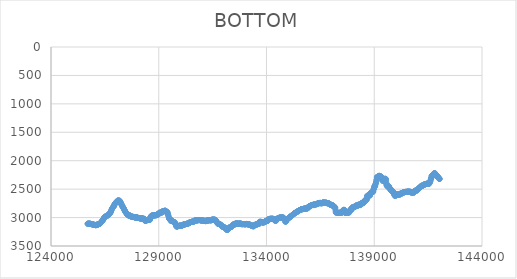
| Category | BOTTOM |
|---|---|
| 125697.8543 | 3108.33 |
| 125704.988 | 3108.33 |
| 125715.2275 | 3108.33 |
| 125725.4675 | 3108.33 |
| 125735.7075 | 3108.33 |
| 125745.9475 | 3108.33 |
| 125756.1875 | 3108.33 |
| 125766.4275 | 3108.33 |
| 125776.6675 | 3108.33 |
| 125786.9075 | 3108.33 |
| 125797.1475 | 3108.33 |
| 125807.3875 | 3108.33 |
| 125817.6275 | 3108.33 |
| 125827.8675 | 3109.05 |
| 125838.1075 | 3111.15 |
| 125848.3475 | 3111.51 |
| 125858.5875 | 3112.56 |
| 125868.8275 | 3112.91 |
| 125879.0675 | 3114.68 |
| 125889.3075 | 3116.78 |
| 125899.5475 | 3117.14 |
| 125909.7875 | 3118.54 |
| 125920.0275 | 3119.95 |
| 125930.2675 | 3120.29 |
| 125940.5075 | 3119.26 |
| 125950.7475 | 3122.41 |
| 125960.9875 | 3122.77 |
| 125971.2275 | 3123.82 |
| 125981.4675 | 3125.96 |
| 125991.7075 | 3131.19 |
| 126001.9475 | 3128.75 |
| 126012.1875 | 3129.78 |
| 126022.4275 | 3127.35 |
| 126032.6675 | 3129.45 |
| 126042.9075 | 3130.16 |
| 126053.1475 | 3132.26 |
| 126063.3875 | 3132.62 |
| 126073.6275 | 3134.74 |
| 126083.8675 | 3135.75 |
| 126094.1075 | 3128.73 |
| 126104.3475 | 3126.63 |
| 126114.5875 | 3126.99 |
| 126124.8275 | 3128.04 |
| 126135.0675 | 3127.63 |
| 126145.3075 | 3126.02 |
| 126155.5475 | 3124.41 |
| 126165.7875 | 3122.81 |
| 126176.0275 | 3121.2 |
| 126186.2675 | 3119.59 |
| 126196.5075 | 3117.98 |
| 126206.7475 | 3116.37 |
| 126216.9875 | 3114.76 |
| 126227.2275 | 3113.15 |
| 126237.4675 | 3111.54 |
| 126247.7075 | 3109.94 |
| 126257.9475 | 3108.33 |
| 126268.1875 | 3106.72 |
| 126278.4275 | 3104.31 |
| 126288.6675 | 3099.56 |
| 126298.9075 | 3094.81 |
| 126309.1475 | 3090.06 |
| 126319.3875 | 3085.31 |
| 126329.6275 | 3080.56 |
| 126339.8675 | 3075.81 |
| 126350.1075 | 3071.06 |
| 126360.3475 | 3066.22 |
| 126370.5875 | 3061.11 |
| 126380.8275 | 3056.01 |
| 126391.0675 | 3050.91 |
| 126401.3075 | 3045.81 |
| 126411.5475 | 3040.7 |
| 126421.7875 | 3035.6 |
| 126432.0275 | 3030.5 |
| 126442.2675 | 3024.19 |
| 126452.5075 | 3014.34 |
| 126462.7475 | 3004.48 |
| 126472.9875 | 2996.5 |
| 126483.2275 | 2993.99 |
| 126493.4675 | 2991.49 |
| 126503.7075 | 2988.99 |
| 126513.9475 | 2986.49 |
| 126524.1875 | 2983.98 |
| 126534.4275 | 2981.48 |
| 126544.6675 | 2978.98 |
| 126554.9075 | 2976.48 |
| 126565.1475 | 2974.09 |
| 126575.3875 | 2972.04 |
| 126585.6275 | 2969.99 |
| 126595.8675 | 2967.95 |
| 126606.1075 | 2965.9 |
| 126616.3475 | 2963.85 |
| 126626.5875 | 2961.81 |
| 126636.8275 | 2959.76 |
| 126647.0675 | 2957.71 |
| 126657.3075 | 2955.66 |
| 126667.5475 | 2953.62 |
| 126677.7875 | 2950.73 |
| 126688.0275 | 2945.38 |
| 126698.2675 | 2940.03 |
| 126708.5075 | 2934.68 |
| 126718.7475 | 2929.33 |
| 126728.9875 | 2923.99 |
| 126739.2275 | 2918.64 |
| 126749.4675 | 2913.29 |
| 126759.7075 | 2907.94 |
| 126769.9475 | 2902.59 |
| 126780.1875 | 2895.81 |
| 126790.4275 | 2884.83 |
| 126800.6675 | 2873.85 |
| 126810.9075 | 2862.87 |
| 126821.1475 | 2851.89 |
| 126831.3875 | 2842.41 |
| 126841.6275 | 2837.3 |
| 126851.8675 | 2832.2 |
| 126862.1075 | 2827.1 |
| 126872.3475 | 2822 |
| 126882.5875 | 2816.89 |
| 126892.8275 | 2811.79 |
| 126903.0675 | 2806.69 |
| 126913.3075 | 2800.59 |
| 126923.5475 | 2791.58 |
| 126933.7875 | 2782.58 |
| 126944.0275 | 2773.57 |
| 126954.2675 | 2764.56 |
| 126964.5075 | 2756.69 |
| 126974.7475 | 2752.19 |
| 126984.9875 | 2747.68 |
| 126995.2275 | 2743.18 |
| 127005.4675 | 2738.68 |
| 127015.7075 | 2734.29 |
| 127025.9475 | 2730.24 |
| 127036.1875 | 2726.19 |
| 127046.4275 | 2722.15 |
| 127056.6675 | 2718.1 |
| 127066.9075 | 2714.05 |
| 127077.1475 | 2710.01 |
| 127087.3875 | 2705.96 |
| 127097.6275 | 2701.87 |
| 127107.8675 | 2698.72 |
| 127118.1075 | 2700.5 |
| 127128.3475 | 2705.75 |
| 127138.5875 | 2705.04 |
| 127148.8275 | 2702.58 |
| 127159.0675 | 2702.25 |
| 127169.3075 | 2703.28 |
| 127179.5475 | 2701.91 |
| 127189.7875 | 2708.95 |
| 127200.0275 | 2715.99 |
| 127210.2675 | 2723.03 |
| 127220.5075 | 2730.06 |
| 127230.7475 | 2737.1 |
| 127240.9875 | 2744.5 |
| 127251.2275 | 2752.94 |
| 127261.4675 | 2761.39 |
| 127271.7075 | 2769.83 |
| 127281.9475 | 2778.28 |
| 127292.1875 | 2786.73 |
| 127302.4275 | 2794.66 |
| 127312.6675 | 2801.1 |
| 127322.9075 | 2807.53 |
| 127333.1475 | 2813.96 |
| 127343.3875 | 2820.4 |
| 127353.6275 | 2826.83 |
| 127363.8675 | 2833.27 |
| 127374.1075 | 2840.06 |
| 127384.3475 | 2847.9 |
| 127394.5875 | 2855.75 |
| 127404.8275 | 2863.59 |
| 127415.0675 | 2871.43 |
| 127425.3075 | 2879.27 |
| 127435.5475 | 2887.12 |
| 127445.7875 | 2894.35 |
| 127456.0275 | 2899.81 |
| 127466.2675 | 2905.26 |
| 127476.5075 | 2910.72 |
| 127486.7475 | 2916.17 |
| 127496.9875 | 2921.62 |
| 127507.2275 | 2927.08 |
| 127517.4675 | 2932.53 |
| 127527.7075 | 2939.11 |
| 127537.9475 | 2946.81 |
| 127548.1875 | 2947.86 |
| 127558.4275 | 2948.22 |
| 127568.6675 | 2948.56 |
| 127578.9075 | 2948.24 |
| 127589.1475 | 2955.28 |
| 127599.3875 | 2962.32 |
| 127609.6275 | 2966.14 |
| 127619.8675 | 2961.94 |
| 127630.1075 | 2962.3 |
| 127640.3475 | 2963.35 |
| 127650.5875 | 2963.71 |
| 127660.8275 | 2965.47 |
| 127671.0675 | 2967.93 |
| 127681.3075 | 2968.98 |
| 127691.5475 | 2969.34 |
| 127701.7875 | 2970.74 |
| 127712.0275 | 2975.37 |
| 127722.2675 | 2985.87 |
| 127732.5075 | 2985.87 |
| 127742.7475 | 2984.8 |
| 127752.9875 | 2982.36 |
| 127763.2275 | 2984.46 |
| 127773.4675 | 2985.53 |
| 127783.7075 | 2988.69 |
| 127793.9475 | 2989.76 |
| 127804.1875 | 2992.91 |
| 127814.4275 | 2991.84 |
| 127824.6675 | 2987.97 |
| 127834.9075 | 2986.94 |
| 127845.1475 | 2990.45 |
| 127855.3875 | 2991.5 |
| 127865.6275 | 2991.86 |
| 127875.8675 | 2992.91 |
| 127886.1075 | 2993.62 |
| 127896.3475 | 2996.8 |
| 127906.5875 | 2999.59 |
| 127916.8275 | 2998.54 |
| 127927.0675 | 2998.54 |
| 127937.3075 | 2998.9 |
| 127947.5475 | 2999.95 |
| 127957.7875 | 3000.3 |
| 127968.0275 | 3000.28 |
| 127978.2675 | 2996.06 |
| 127988.5075 | 2993.98 |
| 127998.7475 | 2998.2 |
| 128008.9875 | 3002.07 |
| 128019.2275 | 3004.53 |
| 128029.4675 | 3005.93 |
| 128039.7075 | 3006.98 |
| 128049.9475 | 3006.98 |
| 128060.1875 | 3007.34 |
| 128070.4275 | 3008.39 |
| 128080.6675 | 3008.39 |
| 128090.9075 | 3008.39 |
| 128101.1475 | 3008.39 |
| 128111.3875 | 3009.46 |
| 128121.6275 | 3013.33 |
| 128131.8675 | 3015.43 |
| 128142.1075 | 3015.43 |
| 128152.3475 | 3015.07 |
| 128162.5875 | 3014.38 |
| 128172.8275 | 3014.72 |
| 128183.0675 | 3012.62 |
| 128193.3075 | 3012.62 |
| 128203.5475 | 3012.97 |
| 128213.7875 | 3014.38 |
| 128224.0275 | 3015.43 |
| 128234.2675 | 3016.15 |
| 128244.5075 | 3018.96 |
| 128254.7475 | 3021.42 |
| 128264.9875 | 3021.75 |
| 128275.2275 | 3019.3 |
| 128285.4675 | 3018.6 |
| 128295.7075 | 3020.37 |
| 128305.9475 | 3022.47 |
| 128316.1875 | 3022.83 |
| 128326.4275 | 3023.88 |
| 128336.6675 | 3024.95 |
| 128346.9075 | 3035.25 |
| 128357.1475 | 3055.18 |
| 128367.3875 | 3052.39 |
| 128377.6275 | 3053.44 |
| 128387.8675 | 3053.08 |
| 128398.1075 | 3052.39 |
| 128408.3475 | 3053.44 |
| 128418.5875 | 3052.36 |
| 128428.8275 | 3048.14 |
| 128439.0675 | 3044.63 |
| 128449.3075 | 3042.87 |
| 128459.5475 | 3041.84 |
| 128469.7875 | 3045.35 |
| 128480.0275 | 3046.04 |
| 128490.2675 | 3044.63 |
| 128500.5075 | 3043.23 |
| 128510.7475 | 3041.82 |
| 128520.9875 | 3039.7 |
| 128531.2275 | 3036.9 |
| 128541.4675 | 3037.95 |
| 128551.7075 | 3037.95 |
| 128561.9475 | 3038.31 |
| 128572.1875 | 3040.43 |
| 128582.4275 | 3043.58 |
| 128592.6675 | 3032.15 |
| 128602.9075 | 2998.9 |
| 128613.1475 | 2999.95 |
| 128623.3875 | 3001.02 |
| 128633.6275 | 3004.17 |
| 128643.8675 | 2995.95 |
| 128654.1075 | 2971.08 |
| 128664.3475 | 2967.91 |
| 128674.5875 | 2965.83 |
| 128684.8275 | 2969.69 |
| 128695.0675 | 2972.51 |
| 128705.3075 | 2973.89 |
| 128715.5475 | 2967.86 |
| 128725.7875 | 2956.31 |
| 128736.0275 | 2956.31 |
| 128746.2675 | 2956.67 |
| 128756.5075 | 2958.79 |
| 128766.7475 | 2962.66 |
| 128776.9875 | 2964.76 |
| 128787.2275 | 2964.4 |
| 128797.4675 | 2962.28 |
| 128807.7075 | 2958.05 |
| 128817.9475 | 2955.97 |
| 128828.1875 | 2959.84 |
| 128838.4275 | 2961.23 |
| 128848.6675 | 2959.48 |
| 128858.9075 | 2959.46 |
| 128869.1475 | 2956.31 |
| 128879.3875 | 2956.67 |
| 128889.6275 | 2958.08 |
| 128899.8675 | 2958.05 |
| 128910.1075 | 2954.19 |
| 128920.3475 | 2952.09 |
| 128930.5875 | 2952.44 |
| 128940.8275 | 2949.21 |
| 128951.0675 | 2936.6 |
| 128961.3075 | 2936.25 |
| 128971.5475 | 2936.27 |
| 128981.7875 | 2938.35 |
| 128992.0275 | 2935.2 |
| 129002.2675 | 2936.27 |
| 129012.5075 | 2933.34 |
| 129022.7475 | 2915.49 |
| 129032.9875 | 2915.13 |
| 129043.2275 | 2914.8 |
| 129053.4675 | 2917.97 |
| 129063.7075 | 2921.12 |
| 129073.9475 | 2921.48 |
| 129084.1875 | 2919.31 |
| 129094.4275 | 2909.86 |
| 129104.6675 | 2908.79 |
| 129114.9075 | 2904.56 |
| 129125.1475 | 2902.49 |
| 129135.3875 | 2906.35 |
| 129145.6275 | 2908.81 |
| 129155.8675 | 2910.22 |
| 129166.1075 | 2906.26 |
| 129176.3475 | 2891.56 |
| 129186.5875 | 2890.85 |
| 129196.8275 | 2887.67 |
| 129207.0675 | 2883.81 |
| 129217.3075 | 2882.78 |
| 129227.5475 | 2887 |
| 129237.7875 | 2889.8 |
| 129248.0275 | 2888.74 |
| 129258.2675 | 2888.39 |
| 129268.5075 | 2886.27 |
| 129278.7475 | 2882.04 |
| 129288.9875 | 2878.18 |
| 129299.2275 | 2877.15 |
| 129309.4675 | 2881.01 |
| 129319.7075 | 2883.47 |
| 129329.9475 | 2885.59 |
| 129340.1875 | 2890.53 |
| 129350.4275 | 2896.5 |
| 129360.6675 | 2898.6 |
| 129370.9075 | 2898.96 |
| 129381.1475 | 2900.36 |
| 129391.3875 | 2902.49 |
| 129401.6275 | 2906.71 |
| 129411.8675 | 2916.65 |
| 129422.1075 | 2937.32 |
| 129432.3475 | 2943.47 |
| 129442.5875 | 2959.42 |
| 129452.8275 | 2975.37 |
| 129463.0675 | 2991.21 |
| 129473.3075 | 3006.69 |
| 129483.5475 | 3019.32 |
| 129493.7875 | 3023.18 |
| 129504.0275 | 3026.36 |
| 129514.2675 | 3030.22 |
| 129524.5075 | 3033.04 |
| 129534.7475 | 3035.49 |
| 129544.9875 | 3041.19 |
| 129555.2275 | 3055.56 |
| 129565.4675 | 3057.66 |
| 129575.7075 | 3057.3 |
| 129585.9475 | 3055.18 |
| 129596.1875 | 3050.96 |
| 129606.4275 | 3048.88 |
| 129616.6675 | 3053.1 |
| 129626.9075 | 3057.32 |
| 129637.1475 | 3061.55 |
| 129647.3875 | 3065.05 |
| 129657.6275 | 3068.25 |
| 129667.8675 | 3074.55 |
| 129678.1075 | 3075.26 |
| 129688.3475 | 3077.01 |
| 129698.5875 | 3077.03 |
| 129708.8275 | 3079.82 |
| 129719.0675 | 3079.85 |
| 129729.3075 | 3084.07 |
| 129739.5475 | 3087.93 |
| 129749.7875 | 3091.82 |
| 129760.0275 | 3099.13 |
| 129770.2675 | 3107.22 |
| 129780.5075 | 3115.31 |
| 129790.7475 | 3123.41 |
| 129800.9875 | 3133.02 |
| 129811.2275 | 3147.1 |
| 129821.4675 | 3157.51 |
| 129831.7075 | 3157.16 |
| 129841.9475 | 3156.81 |
| 129852.1875 | 3156.45 |
| 129862.4275 | 3155.72 |
| 129872.6675 | 3153.84 |
| 129882.9075 | 3151.96 |
| 129893.1475 | 3149.49 |
| 129903.3875 | 3146.7 |
| 129913.6275 | 3147.39 |
| 129923.8675 | 3146.34 |
| 129934.1075 | 3145.98 |
| 129944.3475 | 3144.93 |
| 129954.5875 | 3144.93 |
| 129964.8275 | 3144.22 |
| 129975.0675 | 3142.12 |
| 129985.3075 | 3142.12 |
| 129995.5475 | 3142.12 |
| 130005.7875 | 3142.12 |
| 130016.0275 | 3142.12 |
| 130026.2675 | 3142.12 |
| 130036.5075 | 3142.12 |
| 130046.7475 | 3141.76 |
| 130056.9875 | 3141.42 |
| 130067.2275 | 3143.17 |
| 130077.4675 | 3141.04 |
| 130087.7075 | 3137.18 |
| 130097.9475 | 3135.08 |
| 130108.1875 | 3134.72 |
| 130118.4275 | 3133.31 |
| 130128.6675 | 3130.83 |
| 130138.9075 | 3126.27 |
| 130149.1475 | 3124.15 |
| 130159.3875 | 3121 |
| 130169.6275 | 3121 |
| 130179.8675 | 3121 |
| 130190.1075 | 3121 |
| 130200.3475 | 3121 |
| 130210.5875 | 3120.29 |
| 130220.8275 | 3117.11 |
| 130231.0675 | 3113.96 |
| 130241.3075 | 3113.96 |
| 130251.5475 | 3113.61 |
| 130261.7875 | 3112.56 |
| 130272.0275 | 3112.91 |
| 130282.2675 | 3113.96 |
| 130292.5075 | 3113.61 |
| 130302.7475 | 3111.48 |
| 130312.9875 | 3107.98 |
| 130323.2275 | 3106.57 |
| 130333.4675 | 3105.52 |
| 130343.7075 | 3105.16 |
| 130353.9475 | 3103.04 |
| 130364.1875 | 3099.89 |
| 130374.4275 | 3099.89 |
| 130384.6675 | 3099.89 |
| 130394.9075 | 3099.89 |
| 130405.1475 | 3099.53 |
| 130415.3875 | 3095.98 |
| 130425.6275 | 3087.91 |
| 130435.8675 | 3085.81 |
| 130446.1075 | 3085.1 |
| 130456.3475 | 3082.64 |
| 130466.5875 | 3080.87 |
| 130476.8275 | 3079.13 |
| 130487.0675 | 3079.47 |
| 130497.3075 | 3077.72 |
| 130507.5475 | 3078.06 |
| 130517.7875 | 3075.6 |
| 130528.0275 | 3074.19 |
| 130538.2675 | 3073.14 |
| 130548.5075 | 3073.14 |
| 130558.7475 | 3073.14 |
| 130568.9875 | 3073.5 |
| 130579.2275 | 3073.48 |
| 130589.4675 | 3071.04 |
| 130599.7075 | 3073.14 |
| 130609.9475 | 3072.43 |
| 130620.1875 | 3069.97 |
| 130630.4275 | 3068.92 |
| 130640.6675 | 3066.06 |
| 130650.9075 | 3056.59 |
| 130661.1475 | 3053.44 |
| 130671.3875 | 3053.08 |
| 130681.6275 | 3052.39 |
| 130691.8675 | 3052.72 |
| 130702.1075 | 3050.26 |
| 130712.3475 | 3049.57 |
| 130722.5875 | 3050.26 |
| 130732.8275 | 3048.5 |
| 130743.0675 | 3047.11 |
| 130753.3075 | 3049.21 |
| 130763.5475 | 3049.21 |
| 130773.7875 | 3049.21 |
| 130784.0275 | 3049.21 |
| 130794.2675 | 3048.14 |
| 130804.5075 | 3044.99 |
| 130814.7475 | 3044.99 |
| 130824.9875 | 3045.35 |
| 130835.2275 | 3046.4 |
| 130845.4675 | 3045.68 |
| 130855.7075 | 3042.87 |
| 130865.9475 | 3041.12 |
| 130876.1875 | 3043.25 |
| 130886.4275 | 3045.68 |
| 130896.6675 | 3043.94 |
| 130906.9075 | 3044.99 |
| 130917.1475 | 3044.99 |
| 130927.3875 | 3045.35 |
| 130937.6275 | 3046.4 |
| 130947.8675 | 3046.4 |
| 130958.1075 | 3046.76 |
| 130968.3475 | 3048.16 |
| 130978.5875 | 3049.93 |
| 130988.8275 | 3052.74 |
| 130999.0675 | 3055.2 |
| 131009.3075 | 3055.89 |
| 131019.5475 | 3054.13 |
| 131029.7875 | 3052.03 |
| 131040.0275 | 3051.67 |
| 131050.2675 | 3050.98 |
| 131060.5075 | 3052.39 |
| 131070.7475 | 3053.44 |
| 131080.9875 | 3053.79 |
| 131091.2275 | 3055.56 |
| 131101.4675 | 3058.02 |
| 131111.7075 | 3059.07 |
| 131121.9475 | 3059.07 |
| 131132.1875 | 3059.07 |
| 131142.4275 | 3059.78 |
| 131152.6675 | 3061.17 |
| 131162.9075 | 3060.14 |
| 131173.1475 | 3063.29 |
| 131183.3875 | 3063.65 |
| 131193.6275 | 3061.84 |
| 131203.8675 | 3053.44 |
| 131214.1075 | 3053.08 |
| 131224.3475 | 3052.03 |
| 131234.5875 | 3052.03 |
| 131244.8275 | 3052.03 |
| 131255.0675 | 3052.74 |
| 131265.3075 | 3054.84 |
| 131275.5475 | 3054.84 |
| 131285.7875 | 3054.49 |
| 131296.0275 | 3050.93 |
| 131306.2675 | 3043.94 |
| 131316.5075 | 3044.99 |
| 131326.7475 | 3044.28 |
| 131336.9875 | 3042.18 |
| 131347.2275 | 3043.25 |
| 131357.4675 | 3046.04 |
| 131367.7075 | 3044.63 |
| 131377.9475 | 3044.3 |
| 131388.1875 | 3047.47 |
| 131398.4275 | 3050.62 |
| 131408.6675 | 3049.55 |
| 131418.9075 | 3047.47 |
| 131429.1475 | 3048.12 |
| 131439.3875 | 3040.05 |
| 131449.6275 | 3039.02 |
| 131459.8675 | 3041.46 |
| 131470.1075 | 3039.36 |
| 131480.3475 | 3038.65 |
| 131490.5875 | 3037.62 |
| 131500.8275 | 3040.41 |
| 131511.0675 | 3038.29 |
| 131521.3075 | 3034.78 |
| 131531.5475 | 3033.73 |
| 131541.7875 | 3035.52 |
| 131552.0275 | 3040.77 |
| 131562.2675 | 3040.77 |
| 131572.5075 | 3039.7 |
| 131582.7475 | 3036.19 |
| 131592.9875 | 3035.85 |
| 131603.2275 | 3038.67 |
| 131613.4675 | 3041.48 |
| 131623.7075 | 3044.3 |
| 131633.9475 | 3047.11 |
| 131644.1875 | 3049.93 |
| 131654.4275 | 3053.64 |
| 131664.6675 | 3059.97 |
| 131674.9075 | 3066.3 |
| 131685.1475 | 3072.64 |
| 131695.3875 | 3079.15 |
| 131705.6275 | 3086.19 |
| 131715.8675 | 3093.23 |
| 131726.1075 | 3099.55 |
| 131736.3475 | 3103.77 |
| 131746.5875 | 3107.28 |
| 131756.8275 | 3109.05 |
| 131767.0675 | 3111.86 |
| 131777.3075 | 3113.25 |
| 131787.5475 | 3111.51 |
| 131797.7875 | 3112.91 |
| 131808.0275 | 3114.32 |
| 131818.2675 | 3116.44 |
| 131828.5075 | 3119.24 |
| 131838.7475 | 3118.54 |
| 131848.9875 | 3119.59 |
| 131859.2275 | 3121.74 |
| 131869.4675 | 3129.11 |
| 131879.7075 | 3132.98 |
| 131889.9475 | 3135.44 |
| 131900.1875 | 3136.49 |
| 131910.4275 | 3137.56 |
| 131920.6675 | 3144.28 |
| 131930.9075 | 3155.14 |
| 131941.1475 | 3156.19 |
| 131951.3875 | 3156.55 |
| 131961.6275 | 3157.6 |
| 131971.8675 | 3158.67 |
| 131982.1075 | 3161.82 |
| 131992.3475 | 3162.89 |
| 132002.5875 | 3165.69 |
| 132012.8275 | 3164.64 |
| 132023.0675 | 3166.07 |
| 132033.3075 | 3171.34 |
| 132043.5475 | 3175.56 |
| 132053.7875 | 3178.36 |
| 132064.0275 | 3177.66 |
| 132074.2675 | 3179.43 |
| 132084.5075 | 3182.6 |
| 132094.7475 | 3186.82 |
| 132104.9875 | 3191.17 |
| 132115.2275 | 3195.86 |
| 132125.4675 | 3200.55 |
| 132135.7075 | 3204.77 |
| 132145.9475 | 3208.65 |
| 132156.1875 | 3214.98 |
| 132166.4275 | 3218.48 |
| 132176.6675 | 3218.46 |
| 132186.9075 | 3214.24 |
| 132197.1475 | 3210.37 |
| 132207.3875 | 3207.56 |
| 132217.6275 | 3204.74 |
| 132227.8675 | 3200.86 |
| 132238.1075 | 3193.82 |
| 132248.3475 | 3187.64 |
| 132258.5875 | 3183.98 |
| 132268.8275 | 3180.32 |
| 132279.0675 | 3176.66 |
| 132289.3075 | 3173 |
| 132299.5475 | 3169.91 |
| 132309.7875 | 3168.5 |
| 132320.0275 | 3167.1 |
| 132330.2675 | 3165.69 |
| 132340.5075 | 3164.28 |
| 132350.7475 | 3162.87 |
| 132360.9875 | 3162.18 |
| 132371.2275 | 3162.16 |
| 132381.4675 | 3159.01 |
| 132391.7075 | 3155.43 |
| 132401.9475 | 3143.86 |
| 132412.1875 | 3139.64 |
| 132422.4275 | 3135.77 |
| 132432.6675 | 3133.31 |
| 132442.9075 | 3132.26 |
| 132453.1475 | 3132.26 |
| 132463.3875 | 3128.33 |
| 132473.6275 | 3116.78 |
| 132483.8675 | 3117.14 |
| 132494.1075 | 3117.83 |
| 132504.3475 | 3117.14 |
| 132514.5875 | 3119.26 |
| 132524.8275 | 3123.48 |
| 132535.0675 | 3122.34 |
| 132545.3075 | 3110.1 |
| 132555.5475 | 3110.08 |
| 132565.7875 | 3105.85 |
| 132576.0275 | 3103.06 |
| 132586.2675 | 3104.11 |
| 132596.5075 | 3104.11 |
| 132606.7475 | 3104.82 |
| 132616.9875 | 3105.85 |
| 132627.2275 | 3103.42 |
| 132637.4675 | 3105.52 |
| 132647.7075 | 3106.23 |
| 132657.9475 | 3108.69 |
| 132668.1875 | 3109.74 |
| 132678.4275 | 3110.81 |
| 132688.6675 | 3112.89 |
| 132698.9075 | 3108.67 |
| 132709.1475 | 3105.52 |
| 132719.3875 | 3105.88 |
| 132729.6275 | 3107.28 |
| 132739.8675 | 3107.62 |
| 132750.1075 | 3105.88 |
| 132760.3475 | 3106.57 |
| 132770.5875 | 3105.52 |
| 132780.8275 | 3105.88 |
| 132791.0675 | 3106.57 |
| 132801.3075 | 3105.88 |
| 132811.5475 | 3107.28 |
| 132821.7875 | 3109.4 |
| 132832.0275 | 3112.91 |
| 132842.2675 | 3114.32 |
| 132852.5075 | 3115.73 |
| 132862.7475 | 3116.78 |
| 132872.9875 | 3116.78 |
| 132883.2275 | 3116.42 |
| 132893.4675 | 3115.37 |
| 132903.7075 | 3115.01 |
| 132913.9475 | 3114.32 |
| 132924.1875 | 3115.37 |
| 132934.4275 | 3115.01 |
| 132944.6675 | 3113.96 |
| 132954.9075 | 3114.32 |
| 132965.1475 | 3115.73 |
| 132975.3875 | 3116.78 |
| 132985.6275 | 3116.78 |
| 132995.8675 | 3117.14 |
| 133006.1075 | 3118.54 |
| 133016.3475 | 3119.24 |
| 133026.5875 | 3117.83 |
| 133036.8275 | 3116.06 |
| 133047.0675 | 3113.96 |
| 133057.3075 | 3114.32 |
| 133067.5475 | 3114.3 |
| 133077.7875 | 3111.51 |
| 133088.0275 | 3112.56 |
| 133098.2675 | 3113.27 |
| 133108.5075 | 3116.44 |
| 133118.7475 | 3118.52 |
| 133128.9875 | 3115.73 |
| 133139.2275 | 3117.14 |
| 133149.4675 | 3118.54 |
| 133159.7075 | 3119.59 |
| 133169.9475 | 3119.95 |
| 133180.1875 | 3121 |
| 133190.4275 | 3122.07 |
| 133200.6675 | 3124.51 |
| 133210.9075 | 3122.41 |
| 133221.1475 | 3123.12 |
| 133231.3875 | 3126.3 |
| 133241.6275 | 3129.45 |
| 133251.8675 | 3129.8 |
| 133262.1075 | 3131.93 |
| 133272.3475 | 3136.15 |
| 133282.5875 | 3139.66 |
| 133292.8275 | 3140.35 |
| 133303.0675 | 3139.3 |
| 133313.3075 | 3140.37 |
| 133323.5475 | 3143.52 |
| 133333.7875 | 3143.52 |
| 133344.0275 | 3144.6 |
| 133354.2675 | 3148.46 |
| 133364.5075 | 3151.28 |
| 133374.7475 | 3153.38 |
| 133384.9875 | 3153.38 |
| 133395.2275 | 3153.02 |
| 133405.4675 | 3152.68 |
| 133415.7075 | 3149.07 |
| 133425.9475 | 3131.91 |
| 133436.1875 | 3130.5 |
| 133446.4275 | 3129.45 |
| 133456.6675 | 3129.45 |
| 133466.9075 | 3129.09 |
| 133477.1475 | 3128.04 |
| 133487.3875 | 3126.97 |
| 133497.6275 | 3123.46 |
| 133507.8675 | 3122.41 |
| 133518.1075 | 3121.69 |
| 133528.3475 | 3119.95 |
| 133538.5875 | 3121 |
| 133548.8275 | 3120.29 |
| 133559.0675 | 3118.54 |
| 133569.3075 | 3118.52 |
| 133579.5475 | 3115.37 |
| 133589.7875 | 3115.37 |
| 133600.0275 | 3114.3 |
| 133610.2675 | 3111.15 |
| 133620.5075 | 3111.15 |
| 133630.7475 | 3111.15 |
| 133640.9875 | 3111.51 |
| 133651.2275 | 3112.56 |
| 133661.4675 | 3103.62 |
| 133671.7075 | 3077.01 |
| 133681.9475 | 3075.96 |
| 133692.1875 | 3075.6 |
| 133702.4275 | 3074.55 |
| 133712.6675 | 3074.19 |
| 133722.9075 | 3073.86 |
| 133733.1475 | 3075.96 |
| 133743.3875 | 3076.32 |
| 133753.6275 | 3077.01 |
| 133763.8675 | 3075.96 |
| 133774.1075 | 3076.67 |
| 133784.3475 | 3078.77 |
| 133794.5875 | 3079.85 |
| 133804.8275 | 3083 |
| 133815.0675 | 3084.07 |
| 133825.3075 | 3086.86 |
| 133835.5475 | 3086.17 |
| 133845.7875 | 3086.86 |
| 133856.0275 | 3085.81 |
| 133866.2675 | 3084.74 |
| 133876.5075 | 3080.52 |
| 133886.7475 | 3078.44 |
| 133896.9875 | 3081.23 |
| 133907.2275 | 3080.18 |
| 133917.4675 | 3079.82 |
| 133927.7075 | 3078.42 |
| 133937.9475 | 3074.86 |
| 133948.1875 | 3066.8 |
| 133958.4275 | 3063.62 |
| 133968.6675 | 3059.4 |
| 133978.9075 | 3056.61 |
| 133989.1475 | 3057.66 |
| 133999.3875 | 3058.02 |
| 134009.6275 | 3059.07 |
| 134019.8675 | 3059.07 |
| 134030.1075 | 3059.42 |
| 134040.3475 | 3060.47 |
| 134050.5875 | 3060.47 |
| 134060.8275 | 3053.68 |
| 134071.0675 | 3033.37 |
| 134081.3075 | 3033.04 |
| 134091.5475 | 3034.42 |
| 134101.7875 | 3032.32 |
| 134112.0275 | 3031.25 |
| 134122.2675 | 3029.17 |
| 134132.5075 | 3031.25 |
| 134142.7475 | 3028.46 |
| 134152.9875 | 3028.43 |
| 134163.2275 | 3024.21 |
| 134173.4675 | 3020.7 |
| 134183.7075 | 3020.01 |
| 134193.9475 | 3021.06 |
| 134204.1875 | 3021.42 |
| 134214.4275 | 3022.47 |
| 134224.6675 | 3022.47 |
| 134234.9075 | 3023.18 |
| 134245.1475 | 3024.57 |
| 134255.3875 | 3021.75 |
| 134265.6275 | 3019.65 |
| 134275.8675 | 3020.01 |
| 134286.1075 | 3021.06 |
| 134296.3475 | 3021.78 |
| 134306.5875 | 3024.23 |
| 134316.8275 | 3025.64 |
| 134327.0675 | 3027.41 |
| 134337.3075 | 3029.51 |
| 134347.5475 | 3029.86 |
| 134357.7875 | 3031.27 |
| 134368.0275 | 3036.97 |
| 134378.2675 | 3050.26 |
| 134388.5075 | 3048.86 |
| 134398.7475 | 3048.16 |
| 134408.9875 | 3050.29 |
| 134419.2275 | 3053.79 |
| 134429.4675 | 3054.49 |
| 134439.7075 | 3053.44 |
| 134449.9475 | 3053.44 |
| 134460.1875 | 3045.93 |
| 134470.4275 | 3023.52 |
| 134480.6675 | 3022.11 |
| 134490.9075 | 3021.06 |
| 134501.1475 | 3020.35 |
| 134511.3875 | 3017.89 |
| 134521.6275 | 3016.84 |
| 134531.8675 | 3016.48 |
| 134542.1075 | 3014.36 |
| 134552.3475 | 3011.21 |
| 134562.5875 | 3010.14 |
| 134572.8275 | 3006.63 |
| 134583.0675 | 3005.22 |
| 134593.3075 | 3003.81 |
| 134603.5475 | 3002.4 |
| 134613.7875 | 3001 |
| 134624.0275 | 3000.3 |
| 134634.2675 | 3000.64 |
| 134644.5075 | 2997.47 |
| 134654.7475 | 2995.39 |
| 134664.9875 | 2999.61 |
| 134675.2275 | 3002.76 |
| 134685.4675 | 3002.05 |
| 134695.7075 | 2999.95 |
| 134705.9475 | 2999.95 |
| 134716.1875 | 2999.95 |
| 134726.4275 | 3000.66 |
| 134736.6675 | 3002.4 |
| 134746.9075 | 3001.35 |
| 134757.1475 | 3001.35 |
| 134767.3875 | 3000.28 |
| 134777.6275 | 2998.42 |
| 134787.8675 | 3003.49 |
| 134798.1075 | 3008.55 |
| 134808.3475 | 3013.62 |
| 134818.5875 | 3018.69 |
| 134828.8275 | 3022.83 |
| 134839.0675 | 3023.88 |
| 134849.3075 | 3024.95 |
| 134859.5475 | 3039.18 |
| 134869.7875 | 3070.66 |
| 134880.0275 | 3068.23 |
| 134890.2675 | 3071.4 |
| 134900.5075 | 3070.62 |
| 134910.7475 | 3057.64 |
| 134920.9875 | 3052.01 |
| 134931.2275 | 3046.38 |
| 134941.4675 | 3040.75 |
| 134951.7075 | 3035.12 |
| 134961.9475 | 3029.48 |
| 134972.1875 | 3024.52 |
| 134982.4275 | 3021.53 |
| 134992.6675 | 3018.54 |
| 135002.9075 | 3015.55 |
| 135013.1475 | 3012.56 |
| 135023.3875 | 3009.57 |
| 135033.6275 | 3006.58 |
| 135043.8675 | 3003.59 |
| 135054.1075 | 3000.59 |
| 135064.3475 | 2997.57 |
| 135074.5875 | 2994.56 |
| 135084.8275 | 2991.54 |
| 135095.0675 | 2988.52 |
| 135105.3075 | 2985.51 |
| 135115.5475 | 2982.49 |
| 135125.7875 | 2979.45 |
| 135136.0275 | 2976.32 |
| 135146.2675 | 2973.19 |
| 135156.5075 | 2970.06 |
| 135166.7475 | 2966.93 |
| 135176.9875 | 2963.81 |
| 135187.2275 | 2960.68 |
| 135197.4675 | 2957.55 |
| 135207.7075 | 2954.42 |
| 135217.9475 | 2951.3 |
| 135228.1875 | 2948.2 |
| 135238.4275 | 2945.11 |
| 135248.6675 | 2942.01 |
| 135258.9075 | 2938.91 |
| 135269.1475 | 2935.82 |
| 135279.3875 | 2932.72 |
| 135289.6275 | 2929.62 |
| 135299.8675 | 2926.53 |
| 135310.1075 | 2923.43 |
| 135320.3475 | 2920.52 |
| 135330.5875 | 2918.18 |
| 135340.8275 | 2915.83 |
| 135351.0675 | 2913.49 |
| 135361.3075 | 2911.14 |
| 135371.5475 | 2908.79 |
| 135381.7875 | 2906.45 |
| 135392.0275 | 2904.1 |
| 135402.2675 | 2901.76 |
| 135412.5075 | 2899.39 |
| 135422.7475 | 2896.96 |
| 135432.9875 | 2894.53 |
| 135443.2275 | 2892.09 |
| 135453.4675 | 2889.66 |
| 135463.7075 | 2887.23 |
| 135473.9475 | 2884.8 |
| 135484.1875 | 2882.37 |
| 135494.4275 | 2879.94 |
| 135504.6675 | 2877.51 |
| 135514.9075 | 2875.08 |
| 135525.1475 | 2872.79 |
| 135535.3875 | 2870.95 |
| 135545.6275 | 2869.11 |
| 135555.8675 | 2867.27 |
| 135566.1075 | 2865.43 |
| 135576.3475 | 2863.59 |
| 135586.5875 | 2861.75 |
| 135596.8275 | 2859.91 |
| 135607.0675 | 2858.07 |
| 135617.3075 | 2856.23 |
| 135627.5475 | 2854.39 |
| 135637.7875 | 2852.55 |
| 135648.0275 | 2850.71 |
| 135658.2675 | 2850.76 |
| 135668.5075 | 2854.25 |
| 135678.7475 | 2851.79 |
| 135688.9875 | 2850.74 |
| 135699.2275 | 2850.38 |
| 135709.4675 | 2849.69 |
| 135719.7075 | 2849.31 |
| 135729.9475 | 2844.75 |
| 135740.1875 | 2843.34 |
| 135750.4275 | 2842.65 |
| 135760.6675 | 2843.34 |
| 135770.9075 | 2842.29 |
| 135781.1475 | 2842.65 |
| 135791.3875 | 2844.06 |
| 135801.6275 | 2845.11 |
| 135811.8675 | 2843.68 |
| 135822.1075 | 2839.48 |
| 135832.3475 | 2839.84 |
| 135842.5875 | 2841.24 |
| 135852.8275 | 2842.29 |
| 135863.0675 | 2842.29 |
| 135873.3075 | 2841.22 |
| 135883.5475 | 2835.93 |
| 135893.7875 | 2829.63 |
| 135904.0275 | 2826.77 |
| 135914.2675 | 2824.8 |
| 135924.5075 | 2835.84 |
| 135934.7475 | 2813.09 |
| 135944.9875 | 2813.43 |
| 135955.2275 | 2810.25 |
| 135965.4675 | 2807.46 |
| 135975.7075 | 2808.15 |
| 135985.9475 | 2806.03 |
| 135996.1875 | 2801.81 |
| 136006.4275 | 2797.94 |
| 136016.6675 | 2795.84 |
| 136026.9075 | 2795.13 |
| 136037.1475 | 2793.03 |
| 136047.3875 | 2791.96 |
| 136057.6275 | 2788.45 |
| 136067.8675 | 2787.04 |
| 136078.1075 | 2785.99 |
| 136088.3475 | 2784.2 |
| 136098.5875 | 2778.95 |
| 136108.8275 | 2778.95 |
| 136119.0675 | 2778.95 |
| 136129.3075 | 2778.59 |
| 136139.5475 | 2777.54 |
| 136149.7875 | 2777.54 |
| 136160.0275 | 2777.54 |
| 136170.2675 | 2778.97 |
| 136180.5075 | 2779.96 |
| 136190.7475 | 2770.15 |
| 136200.9875 | 2773.39 |
| 136211.2275 | 2781.7 |
| 136221.4675 | 2769.1 |
| 136231.7075 | 2768.74 |
| 136241.9475 | 2768.05 |
| 136252.1875 | 2769.1 |
| 136262.4275 | 2769.81 |
| 136272.6675 | 2769.41 |
| 136282.9075 | 2762.77 |
| 136293.1475 | 2764.52 |
| 136303.3875 | 2763.47 |
| 136313.6275 | 2764.18 |
| 136323.8675 | 2766.28 |
| 136334.1075 | 2764.14 |
| 136344.3475 | 2756.76 |
| 136354.5875 | 2755.04 |
| 136364.8275 | 2758.89 |
| 136375.0675 | 2757.84 |
| 136385.3075 | 2754.98 |
| 136395.5475 | 2746.58 |
| 136405.7875 | 2746.58 |
| 136416.0275 | 2746.58 |
| 136426.2675 | 2746.58 |
| 136436.5075 | 2746.58 |
| 136446.7475 | 2746.58 |
| 136456.9875 | 2746.93 |
| 136467.2275 | 2745.84 |
| 136477.4675 | 2739.54 |
| 136487.7075 | 2742.04 |
| 136497.9475 | 2746.89 |
| 136508.1875 | 2742.04 |
| 136518.4275 | 2749.03 |
| 136528.6675 | 2747.63 |
| 136538.9075 | 2746.58 |
| 136549.1475 | 2746.93 |
| 136559.3875 | 2747.98 |
| 136569.6275 | 2748.34 |
| 136579.8675 | 2747.96 |
| 136590.1075 | 2743.76 |
| 136600.3475 | 2743.76 |
| 136610.5875 | 2740.9 |
| 136620.8275 | 2732.5 |
| 136631.0675 | 2733.21 |
| 136641.3075 | 2734.96 |
| 136651.5475 | 2734.62 |
| 136661.7875 | 2737.08 |
| 136672.0275 | 2738.13 |
| 136682.2675 | 2738.49 |
| 136692.5075 | 2739.89 |
| 136702.7475 | 2741.3 |
| 136712.9875 | 2742 |
| 136723.2275 | 2741.3 |
| 136733.4675 | 2742.71 |
| 136743.7075 | 2740.9 |
| 136753.9475 | 2732.5 |
| 136764.1875 | 2735 |
| 136774.4275 | 2742.71 |
| 136784.6675 | 2744.12 |
| 136794.9075 | 2745.88 |
| 136805.1475 | 2747.27 |
| 136815.3875 | 2745.17 |
| 136825.6275 | 2745.53 |
| 136835.8675 | 2747.65 |
| 136846.1075 | 2750.8 |
| 136856.3475 | 2749.73 |
| 136866.5875 | 2746.58 |
| 136876.8275 | 2748.01 |
| 136887.0675 | 2753.28 |
| 136897.3075 | 2756.07 |
| 136907.5475 | 2755.74 |
| 136917.7875 | 2759.27 |
| 136928.0275 | 2764.18 |
| 136938.2675 | 2767.71 |
| 136948.5075 | 2771.91 |
| 136958.7475 | 2772.27 |
| 136968.9875 | 2772.96 |
| 136979.2275 | 2772.27 |
| 136989.4675 | 2773.68 |
| 136999.7075 | 2775.44 |
| 137009.9475 | 2778.97 |
| 137020.1875 | 2782.82 |
| 137030.4275 | 2781.77 |
| 137040.6675 | 2781.77 |
| 137050.9075 | 2782.12 |
| 137061.1475 | 2783.89 |
| 137071.3875 | 2786.35 |
| 137081.6275 | 2788.83 |
| 137091.8675 | 2793.03 |
| 137102.1075 | 2793.03 |
| 137112.3475 | 2794.46 |
| 137122.5875 | 2802.23 |
| 137132.8275 | 2813.45 |
| 137143.0675 | 2815.55 |
| 137153.3075 | 2815.91 |
| 137163.5475 | 2816.96 |
| 137173.7875 | 2818.03 |
| 137184.0275 | 2821.54 |
| 137194.2675 | 2833.66 |
| 137204.5075 | 2879.09 |
| 137214.7475 | 2910.47 |
| 137224.9875 | 2896.92 |
| 137235.2275 | 2912.67 |
| 137245.4675 | 2912.32 |
| 137255.7075 | 2911.27 |
| 137265.9475 | 2911.27 |
| 137276.1875 | 2911.27 |
| 137286.4275 | 2911.98 |
| 137296.6675 | 2914.08 |
| 137306.9075 | 2914.8 |
| 137317.1475 | 2916.9 |
| 137327.3875 | 2917.25 |
| 137337.6275 | 2918.66 |
| 137347.8675 | 2919.71 |
| 137358.1075 | 2920.07 |
| 137368.3475 | 2921.12 |
| 137378.5875 | 2920.41 |
| 137388.8275 | 2918.3 |
| 137399.0675 | 2917.95 |
| 137409.3075 | 2916.9 |
| 137419.5475 | 2915.47 |
| 137429.7875 | 2911.27 |
| 137440.0275 | 2910.55 |
| 137450.2675 | 2908.45 |
| 137460.5075 | 2908.45 |
| 137470.7475 | 2909.52 |
| 137480.9875 | 2912.67 |
| 137491.2275 | 2913.03 |
| 137501.4675 | 2911.94 |
| 137511.7075 | 2905.28 |
| 137521.9475 | 2904.59 |
| 137532.1875 | 2904.21 |
| 137542.4275 | 2902.15 |
| 137552.6675 | 2897.73 |
| 137562.9075 | 2866.22 |
| 137573.1475 | 2875.16 |
| 137583.3875 | 2892.12 |
| 137593.6275 | 2864.82 |
| 137603.8675 | 2864.82 |
| 137614.1075 | 2864.82 |
| 137624.3475 | 2873.03 |
| 137634.5875 | 2902.91 |
| 137644.8275 | 2918.64 |
| 137655.0675 | 2915.13 |
| 137665.3075 | 2914.44 |
| 137675.5475 | 2915.49 |
| 137685.7875 | 2914.77 |
| 137696.0275 | 2912.67 |
| 137706.2675 | 2912.67 |
| 137716.5075 | 2912.32 |
| 137726.7475 | 2912.7 |
| 137736.9875 | 2915.47 |
| 137747.2275 | 2911.27 |
| 137757.4675 | 2910.91 |
| 137767.7075 | 2910.22 |
| 137777.9475 | 2911.27 |
| 137788.1875 | 2911.27 |
| 137798.4275 | 2910.19 |
| 137808.6675 | 2904.54 |
| 137818.9075 | 2901.12 |
| 137829.1475 | 2913.39 |
| 137839.3875 | 2910.13 |
| 137849.6275 | 2890.44 |
| 137859.8675 | 2877.46 |
| 137870.1075 | 2873.98 |
| 137880.3475 | 2876.08 |
| 137890.5875 | 2871.07 |
| 137900.8275 | 2856.01 |
| 137911.0675 | 2854.6 |
| 137921.3075 | 2852.84 |
| 137931.5475 | 2854.31 |
| 137941.7875 | 2865.17 |
| 137952.0275 | 2857.65 |
| 137962.2675 | 2832.44 |
| 137972.5075 | 2831.73 |
| 137982.7475 | 2826.77 |
| 137992.9875 | 2818.36 |
| 138003.2275 | 2818.01 |
| 138013.4675 | 2817.31 |
| 138023.7075 | 2818.36 |
| 138033.9475 | 2818.36 |
| 138044.1875 | 2816.58 |
| 138054.4275 | 2811.33 |
| 138064.6675 | 2811.33 |
| 138074.9075 | 2811.33 |
| 138085.1475 | 2810.97 |
| 138095.3875 | 2807.77 |
| 138105.6275 | 2801.47 |
| 138115.8675 | 2801.47 |
| 138126.1075 | 2801.47 |
| 138136.3475 | 2801.83 |
| 138146.5875 | 2802.88 |
| 138156.8275 | 2798.23 |
| 138167.0675 | 2784.58 |
| 138177.3075 | 2784.58 |
| 138187.5475 | 2786.01 |
| 138197.7875 | 2790.21 |
| 138208.0275 | 2789.5 |
| 138218.2675 | 2787.4 |
| 138228.5075 | 2787.4 |
| 138238.7475 | 2787.4 |
| 138248.9875 | 2787.4 |
| 138259.2275 | 2785.25 |
| 138269.4675 | 2776.81 |
| 138279.7075 | 2770.51 |
| 138289.9475 | 2770.86 |
| 138300.1875 | 2771.91 |
| 138310.4275 | 2772.27 |
| 138320.6675 | 2773.32 |
| 138330.9075 | 2776.54 |
| 138341.1475 | 2782.77 |
| 138351.3875 | 2772.25 |
| 138361.6275 | 2769.1 |
| 138371.8675 | 2769.1 |
| 138382.1075 | 2767.31 |
| 138392.3475 | 2760.99 |
| 138402.5875 | 2758.55 |
| 138412.8275 | 2755.29 |
| 138423.0675 | 2739.89 |
| 138433.3075 | 2741.3 |
| 138443.5475 | 2742 |
| 138453.7875 | 2740.59 |
| 138464.0275 | 2740.97 |
| 138474.2675 | 2746.6 |
| 138484.5075 | 2749.01 |
| 138494.7475 | 2740.19 |
| 138504.9875 | 2729.68 |
| 138515.2275 | 2729.68 |
| 138525.4675 | 2727.18 |
| 138535.7075 | 2719.12 |
| 138545.9475 | 2718.8 |
| 138556.1875 | 2717.26 |
| 138566.4275 | 2696.24 |
| 138576.6675 | 2694.52 |
| 138586.9075 | 2698.36 |
| 138597.1475 | 2694.81 |
| 138607.3875 | 2687.81 |
| 138617.6275 | 2688.51 |
| 138627.8675 | 2687.1 |
| 138638.1075 | 2686.05 |
| 138648.3475 | 2686.05 |
| 138658.5875 | 2669.97 |
| 138668.8275 | 2621.99 |
| 138679.0675 | 2618.82 |
| 138689.3075 | 2614.95 |
| 138699.5475 | 2612.14 |
| 138709.7875 | 2611.47 |
| 138720.0275 | 2613.52 |
| 138730.2675 | 2607.58 |
| 138740.5075 | 2608.63 |
| 138750.7475 | 2607.56 |
| 138760.9875 | 2603.33 |
| 138771.2275 | 2599.83 |
| 138781.4675 | 2598.78 |
| 138791.7075 | 2606.64 |
| 138801.9475 | 2615.81 |
| 138812.1875 | 2578.42 |
| 138822.4275 | 2582.85 |
| 138832.6675 | 2566.78 |
| 138842.9075 | 2569.17 |
| 138853.1475 | 2560.77 |
| 138863.3875 | 2560.77 |
| 138873.6275 | 2560.41 |
| 138883.8675 | 2559.72 |
| 138894.1075 | 2557.91 |
| 138904.3475 | 2549.87 |
| 138914.5875 | 2551.27 |
| 138924.8275 | 2552.32 |
| 138935.0675 | 2549.11 |
| 138945.3075 | 2543.23 |
| 138955.5475 | 2542.65 |
| 138965.7875 | 2506.88 |
| 138976.0275 | 2497.43 |
| 138986.2675 | 2491.71 |
| 138996.5075 | 2468.47 |
| 139006.7475 | 2449.57 |
| 139016.9875 | 2449.57 |
| 139027.2275 | 2447.78 |
| 139037.4675 | 2444.67 |
| 139047.7075 | 2440.61 |
| 139057.9475 | 2409.44 |
| 139068.1875 | 2402.69 |
| 139078.4275 | 2387.97 |
| 139088.6675 | 2375.53 |
| 139098.9075 | 2348.22 |
| 139109.1475 | 2333.93 |
| 139119.3875 | 2290.84 |
| 139129.6275 | 2287.34 |
| 139139.8675 | 2285.57 |
| 139150.1075 | 2283.47 |
| 139160.3475 | 2283.11 |
| 139170.5875 | 2281.71 |
| 139180.8275 | 2278.51 |
| 139191.0675 | 2271.85 |
| 139201.3075 | 2270.8 |
| 139211.5475 | 2269.73 |
| 139221.7875 | 2265.86 |
| 139232.0275 | 2265.19 |
| 139242.2675 | 2269.04 |
| 139252.5075 | 2267.99 |
| 139262.7475 | 2268.34 |
| 139272.9875 | 2270.82 |
| 139283.2275 | 2277.17 |
| 139293.4675 | 2281.33 |
| 139303.7075 | 2278.6 |
| 139313.9475 | 2289.1 |
| 139324.1875 | 2287.31 |
| 139334.4275 | 2285.28 |
| 139344.6675 | 2294.73 |
| 139354.9075 | 2300.09 |
| 139365.1475 | 2324.06 |
| 139375.3875 | 2348.22 |
| 139385.6275 | 2348.22 |
| 139395.8675 | 2350.36 |
| 139406.1075 | 2354.16 |
| 139416.3475 | 2346.81 |
| 139426.5875 | 2347.17 |
| 139436.8275 | 2348.58 |
| 139447.0675 | 2353.92 |
| 139457.3075 | 2365.45 |
| 139467.5475 | 2363.01 |
| 139477.7875 | 2365.47 |
| 139488.0275 | 2354.37 |
| 139498.2675 | 2317.59 |
| 139508.5075 | 2315.51 |
| 139518.7475 | 2320.45 |
| 139528.9875 | 2323.91 |
| 139539.2275 | 2322.59 |
| 139549.4675 | 2344.15 |
| 139559.7075 | 2387.14 |
| 139569.9475 | 2430.26 |
| 139580.1875 | 2439.72 |
| 139590.4275 | 2438.29 |
| 139600.6675 | 2439.44 |
| 139610.9075 | 2453.06 |
| 139621.1475 | 2447.47 |
| 139631.3875 | 2448.5 |
| 139641.6275 | 2446.42 |
| 139651.8675 | 2449.93 |
| 139662.1075 | 2450.26 |
| 139672.3475 | 2448.16 |
| 139682.5875 | 2452.81 |
| 139692.8275 | 2472.53 |
| 139703.0675 | 2489.67 |
| 139713.3075 | 2487.93 |
| 139723.5475 | 2490.41 |
| 139733.7875 | 2492.83 |
| 139744.0275 | 2489.36 |
| 139754.2675 | 2495.33 |
| 139764.5075 | 2502.79 |
| 139774.7475 | 2520.33 |
| 139784.9875 | 2526.29 |
| 139795.2275 | 2529.11 |
| 139805.4675 | 2530.5 |
| 139815.7075 | 2527.68 |
| 139825.9475 | 2526.65 |
| 139836.1875 | 2530.52 |
| 139846.4275 | 2535.12 |
| 139856.6675 | 2544.26 |
| 139866.9075 | 2549.87 |
| 139877.1475 | 2551.63 |
| 139887.3875 | 2554.09 |
| 139897.6275 | 2561.21 |
| 139907.8675 | 2581.21 |
| 139918.1075 | 2587.87 |
| 139928.3475 | 2586.42 |
| 139938.5875 | 2588.36 |
| 139948.8275 | 2615.31 |
| 139959.0675 | 2614.62 |
| 139969.3075 | 2615.67 |
| 139979.5475 | 2616.02 |
| 139989.7875 | 2615.29 |
| 140000.0275 | 2607.54 |
| 140010.2675 | 2600.18 |
| 140020.5075 | 2599.47 |
| 140030.7475 | 2595.58 |
| 140040.9875 | 2590.33 |
| 140051.2275 | 2591.76 |
| 140061.4675 | 2595.25 |
| 140071.7075 | 2593.86 |
| 140081.9475 | 2595.96 |
| 140092.1875 | 2596.32 |
| 140102.4275 | 2596.3 |
| 140112.6675 | 2592.79 |
| 140122.9075 | 2591.74 |
| 140133.1475 | 2591.74 |
| 140143.3875 | 2592.1 |
| 140153.6275 | 2593.5 |
| 140163.8675 | 2594.55 |
| 140174.1075 | 2593.48 |
| 140184.3475 | 2590.33 |
| 140194.5875 | 2590.33 |
| 140204.8275 | 2590.33 |
| 140215.0675 | 2590.33 |
| 140225.3075 | 2586.76 |
| 140235.5475 | 2574.11 |
| 140245.7875 | 2569.95 |
| 140256.0275 | 2576.25 |
| 140266.2675 | 2576.25 |
| 140276.5075 | 2576.61 |
| 140286.7475 | 2575.16 |
| 140296.9875 | 2567.81 |
| 140307.2275 | 2567.81 |
| 140317.4675 | 2567.81 |
| 140327.7075 | 2567.81 |
| 140337.9475 | 2564.95 |
| 140348.1875 | 2556.19 |
| 140358.4275 | 2555.14 |
| 140368.6675 | 2554.78 |
| 140378.9075 | 2553.73 |
| 140389.1475 | 2553.73 |
| 140399.3875 | 2553.37 |
| 140409.6275 | 2552.32 |
| 140419.8675 | 2551.25 |
| 140430.1075 | 2548.1 |
| 140440.3475 | 2548.1 |
| 140450.5875 | 2548.46 |
| 140460.8275 | 2549.15 |
| 140471.0675 | 2548.1 |
| 140481.3075 | 2548.1 |
| 140491.5475 | 2548.1 |
| 140501.7875 | 2548.1 |
| 140512.0275 | 2548.1 |
| 140522.2675 | 2548.1 |
| 140532.5075 | 2547.03 |
| 140542.7475 | 2543.52 |
| 140552.9875 | 2544.62 |
| 140563.2275 | 2548.42 |
| 140573.4675 | 2541.42 |
| 140583.7075 | 2544.26 |
| 140593.9475 | 2549.15 |
| 140604.1875 | 2547.03 |
| 140614.4275 | 2544.95 |
| 140624.6675 | 2547.03 |
| 140634.9075 | 2544.24 |
| 140645.1475 | 2545.29 |
| 140655.3875 | 2546 |
| 140665.6275 | 2548.1 |
| 140675.8675 | 2548.46 |
| 140686.1075 | 2549.87 |
| 140696.3475 | 2551.27 |
| 140706.5875 | 2554.11 |
| 140716.8275 | 2559.36 |
| 140727.0675 | 2559.36 |
| 140737.3075 | 2559.72 |
| 140747.5475 | 2561.49 |
| 140757.7875 | 2561.44 |
| 140768.0275 | 2555.14 |
| 140778.2675 | 2556.57 |
| 140788.5075 | 2560.77 |
| 140798.7475 | 2561.13 |
| 140808.9875 | 2562.54 |
| 140819.2275 | 2563.94 |
| 140829.4675 | 2559.63 |
| 140839.7075 | 2543.52 |
| 140849.9475 | 2542.83 |
| 140860.1875 | 2543.88 |
| 140870.4275 | 2543.88 |
| 140880.6675 | 2541.02 |
| 140890.9075 | 2532.26 |
| 140901.1475 | 2529.42 |
| 140911.3875 | 2524.53 |
| 140921.6275 | 2525.22 |
| 140931.8675 | 2524.17 |
| 140942.1075 | 2524.89 |
| 140952.3475 | 2525.56 |
| 140962.5875 | 2521.36 |
| 140972.8275 | 2521.36 |
| 140983.0675 | 2522.07 |
| 140993.3075 | 2522.03 |
| 141003.5475 | 2514.3 |
| 141013.7875 | 2510.1 |
| 141024.0275 | 2507.95 |
| 141034.2675 | 2497.72 |
| 141044.5075 | 2487.24 |
| 141054.7475 | 2489.32 |
| 141064.9875 | 2487.24 |
| 141075.2275 | 2487.89 |
| 141085.4675 | 2480.54 |
| 141095.7075 | 2480.18 |
| 141105.9475 | 2478.06 |
| 141116.1875 | 2473.48 |
| 141126.4275 | 2466.77 |
| 141136.6675 | 2459.06 |
| 141146.9075 | 2458.37 |
| 141157.1475 | 2457.28 |
| 141167.3875 | 2450.62 |
| 141177.6275 | 2447.07 |
| 141187.8675 | 2440.07 |
| 141198.1075 | 2441.48 |
| 141208.3475 | 2442.53 |
| 141218.5875 | 2443.25 |
| 141228.8275 | 2445.35 |
| 141239.0675 | 2442.13 |
| 141249.3075 | 2432.32 |
| 141259.5475 | 2430.2 |
| 141269.7875 | 2428.12 |
| 141280.0275 | 2431.63 |
| 141290.2675 | 2430.53 |
| 141300.5075 | 2422.8 |
| 141310.7475 | 2418.6 |
| 141320.9875 | 2418.6 |
| 141331.2275 | 2418.6 |
| 141341.4675 | 2418.24 |
| 141351.7075 | 2417.19 |
| 141361.9475 | 2415.76 |
| 141372.1875 | 2411.92 |
| 141382.4275 | 2412.61 |
| 141392.6675 | 2410.85 |
| 141402.9075 | 2408.03 |
| 141413.1475 | 2406.65 |
| 141423.3875 | 2407.68 |
| 141433.6275 | 2404.88 |
| 141443.8675 | 2405.22 |
| 141454.1075 | 2403.12 |
| 141464.3475 | 2403.47 |
| 141474.5875 | 2404.53 |
| 141484.8275 | 2404.88 |
| 141495.0675 | 2406.29 |
| 141505.3075 | 2406.98 |
| 141515.5475 | 2404.15 |
| 141525.7875 | 2399.25 |
| 141536.0275 | 2401.37 |
| 141546.2675 | 2404.88 |
| 141556.5075 | 2399.86 |
| 141566.7475 | 2382.72 |
| 141576.9875 | 2382.32 |
| 141587.2275 | 2372.46 |
| 141597.4675 | 2362.97 |
| 141607.7075 | 2354.16 |
| 141617.9475 | 2338.59 |
| 141628.1875 | 2312.65 |
| 141638.4275 | 2309.19 |
| 141648.6675 | 2302.65 |
| 141658.9075 | 2268.7 |
| 141669.1475 | 2269.01 |
| 141679.3875 | 2264.12 |
| 141689.6275 | 2264.1 |
| 141699.8675 | 2259.52 |
| 141710.1075 | 2255.32 |
| 141720.3475 | 2253.17 |
| 141730.5875 | 2246.87 |
| 141740.8275 | 2245.09 |
| 141751.0675 | 2237.69 |
| 141761.3075 | 2228.89 |
| 141771.5475 | 2222.96 |
| 141781.7875 | 2227.17 |
| 141792.0275 | 2226.81 |
| 141802.2675 | 2223.26 |
| 141812.5075 | 2218.05 |
| 141822.7475 | 2226.49 |
| 141832.9875 | 2234.94 |
| 141843.2275 | 2240.53 |
| 141853.4675 | 2238.78 |
| 141863.7075 | 2244.12 |
| 141873.9475 | 2258.15 |
| 141884.1875 | 2264.14 |
| 141894.4275 | 2267.96 |
| 141904.6675 | 2265.91 |
| 141914.9075 | 2271.14 |
| 141925.1475 | 2268.34 |
| 141935.3875 | 2272.61 |
| 141945.6275 | 2283.13 |
| 141955.8675 | 2288.79 |
| 141966.1075 | 2297.93 |
| 141976.3475 | 2300.68 |
| 141986.5875 | 2295.82 |
| 141996.8275 | 2305.32 |
| 142007.0675 | 2313.41 |
| 142017.3075 | 2318.66 |
| 142027.5475 | 2319.04 |
| 142037.0758 | 2320.07 |